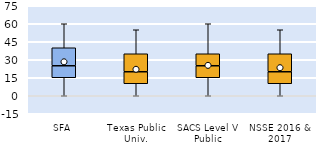
| Category | 25th | 50th | 75th |
|---|---|---|---|
| SFA | 15 | 10 | 15 |
| Texas Public Univ. | 10 | 10 | 15 |
| SACS Level V Public | 15 | 10 | 10 |
| NSSE 2016 & 2017 | 10 | 10 | 15 |